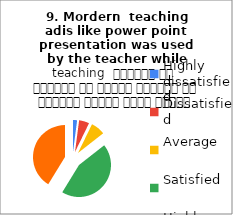
| Category |  9. Mordern  teaching 
adis like power point presentation was used by the teacher while teaching  शिक्षक ने शिक्षण के दौरान शिक्षण की आधुनिक तकनीक पावर पॉइंट का प्रयोग किया |
|---|---|
| Highly dissatisfied | 2 |
| Dissatisfied | 5 |
| Average | 7 |
| Satisfied | 43 |
| Highly satisfied | 40 |